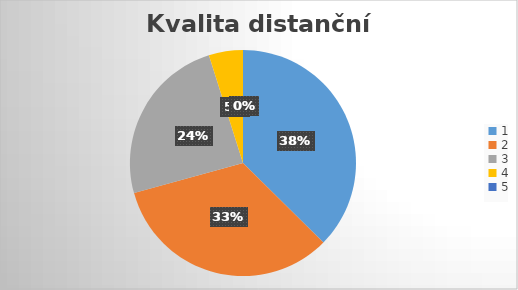
| Category | Series 0 |
|---|---|
| 0 | 46 |
| 1 | 41 |
| 2 | 30 |
| 3 | 6 |
| 4 | 0 |